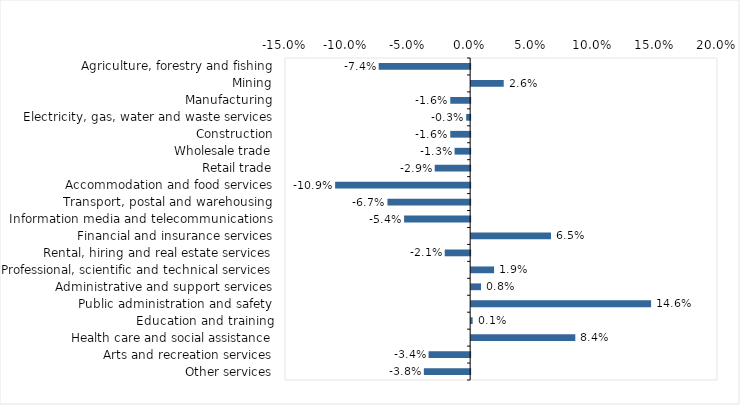
| Category | This week |
|---|---|
| Agriculture, forestry and fishing | -0.074 |
| Mining | 0.026 |
| Manufacturing | -0.016 |
| Electricity, gas, water and waste services | -0.003 |
| Construction | -0.016 |
| Wholesale trade | -0.013 |
| Retail trade | -0.029 |
| Accommodation and food services | -0.109 |
| Transport, postal and warehousing | -0.067 |
| Information media and telecommunications | -0.054 |
| Financial and insurance services | 0.065 |
| Rental, hiring and real estate services | -0.021 |
| Professional, scientific and technical services | 0.019 |
| Administrative and support services | 0.008 |
| Public administration and safety | 0.146 |
| Education and training | 0.001 |
| Health care and social assistance | 0.084 |
| Arts and recreation services | -0.034 |
| Other services | -0.038 |